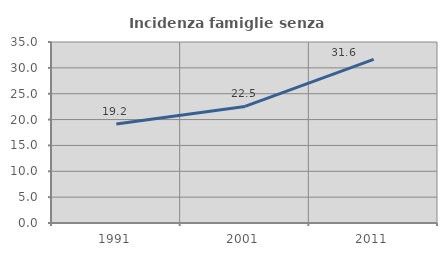
| Category | Incidenza famiglie senza nuclei |
|---|---|
| 1991.0 | 19.156 |
| 2001.0 | 22.542 |
| 2011.0 | 31.624 |